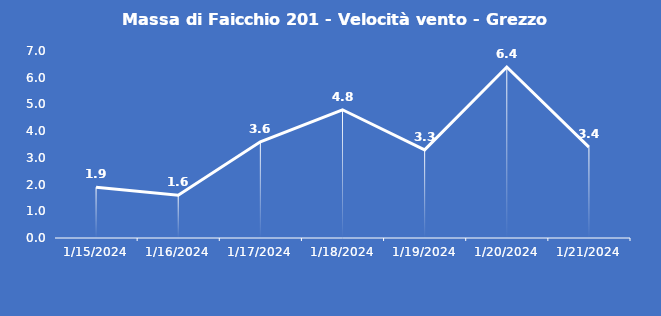
| Category | Massa di Faicchio 201 - Velocità vento - Grezzo (m/s) |
|---|---|
| 1/15/24 | 1.9 |
| 1/16/24 | 1.6 |
| 1/17/24 | 3.6 |
| 1/18/24 | 4.8 |
| 1/19/24 | 3.3 |
| 1/20/24 | 6.4 |
| 1/21/24 | 3.4 |